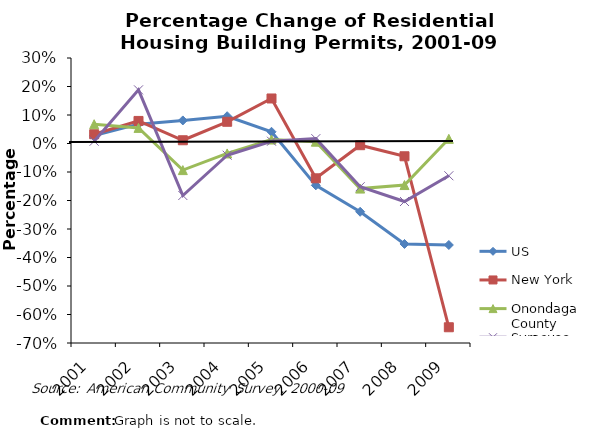
| Category | US | New York | Onondaga County | Syracuse |
|---|---|---|---|---|
| 2001.0 | 0.028 | 0.033 | 0.068 | 0.008 |
| 2002.0 | 0.068 | 0.079 | 0.055 | 0.188 |
| 2003.0 | 0.081 | 0.011 | -0.093 | -0.182 |
| 2004.0 | 0.096 | 0.076 | -0.035 | -0.041 |
| 2005.0 | 0.041 | 0.158 | 0.014 | 0.008 |
| 2006.0 | -0.147 | -0.122 | 0.006 | 0.017 |
| 2007.0 | -0.24 | -0.006 | -0.158 | -0.152 |
| 2008.0 | -0.353 | -0.045 | -0.146 | -0.204 |
| 2009.0 | -0.356 | -0.645 | 0.016 | -0.113 |